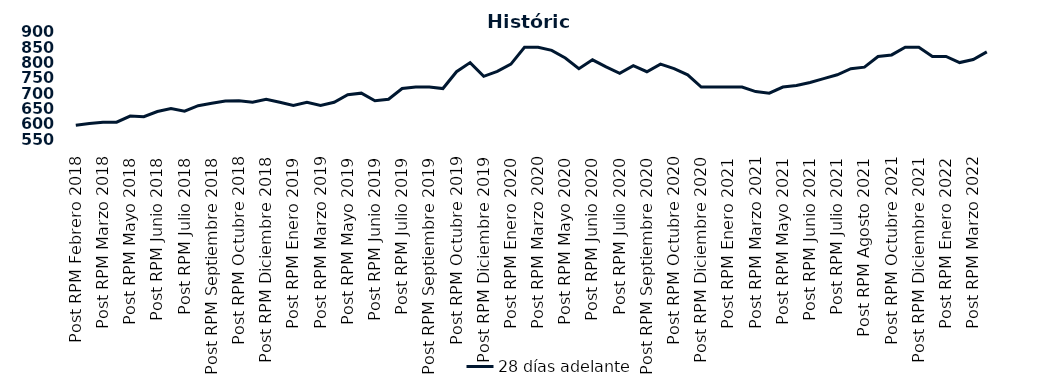
| Category | 28 días adelante |
|---|---|
| Post RPM Febrero 2018 | 595 |
| Pre RPM Marzo 2018 | 601 |
| Post RPM Marzo 2018 | 605 |
| Pre RPM Mayo 2018 | 605 |
| Post RPM Mayo 2018 | 625 |
| Pre RPM Junio 2018 | 623 |
| Post RPM Junio 2018 | 640 |
| Pre RPM Julio 2018 | 650 |
| Post RPM Julio 2018 | 641 |
| Pre RPM Septiembre 2018 | 659 |
| Post RPM Septiembre 2018 | 666.75 |
| Pre RPM Octubre 2018 | 674 |
| Post RPM Octubre 2018 | 675 |
| Pre RPM Diciembre 2018 | 670 |
| Post RPM Diciembre 2018 | 680 |
| Pre RPM Enero 2019 | 670 |
| Post RPM Enero 2019 | 660 |
| Pre RPM Marzo 2019 | 670 |
| Post RPM Marzo 2019 | 660 |
| Pre RPM Mayo 2019 | 670 |
| Post RPM Mayo 2019 | 695 |
| Pre RPM Junio 2019 | 700 |
| Post RPM Junio 2019 | 675 |
| Pre RPM Julio 2019 | 680 |
| Post RPM Julio 2019 | 715 |
| Pre RPM Septiembre 2019 | 720 |
| Post RPM Septiembre 2019 | 720 |
| Pre RPM Octubre 2019 | 715 |
| Post RPM Octubre 2019 | 770 |
| Pre RPM Diciembre 2019 | 800 |
| Post RPM Diciembre 2019 | 755 |
| Pre RPM Enero 2020 | 771 |
| Post RPM Enero 2020 | 795 |
| Pre RPM Marzo 2020 | 850 |
| Post RPM Marzo 2020 | 850 |
| Pre RPM Mayo 2020 | 840 |
| Post RPM Mayo 2020 | 815 |
| Pre RPM Junio 2020 | 780 |
| Post RPM Junio 2020 | 809 |
| Pre RPM Julio 2020 | 785.72 |
| Post RPM Julio 2020 | 765 |
| Pre RPM Septiembre 2020 | 790 |
| Post RPM Septiembre 2020 | 770 |
| Pre RPM Octubre 2020 | 795 |
| Post RPM Octubre 2020 | 780 |
| Pre RPM Diciembre 2020 | 760 |
| Post RPM Diciembre 2020 | 720 |
| Pre RPM Enero 2021 | 720 |
| Post RPM Enero 2021 | 720 |
| Pre RPM Marzo 2021 | 720 |
| Post RPM Marzo 2021 | 705 |
| Pre RPM Mayo 2021 | 700 |
| Post RPM Mayo 2021 | 720 |
| Pre RPM Junio 2021 | 725 |
| Post RPM Junio 2021 | 735 |
| Pre RPM Julio 2021 | 747.5 |
| Post RPM Julio 2021 | 760 |
| Pre RPM Agosto 2021 | 780 |
| Post RPM Agosto 2021 | 785 |
| Pre RPM Octubre 2021 | 820 |
| Post RPM Octubre 2021 | 825 |
| Pre RPM Diciembre 2021 | 850 |
| Post RPM Diciembre 2021 | 850 |
| Pre RPM Enero 2022 | 820 |
| Post RPM Enero 2022 | 820 |
| Pre RPM Marzo 2022 | 800 |
| Post RPM Marzo 2022 | 810 |
| Pre RPM Mayo 2022 | 835 |